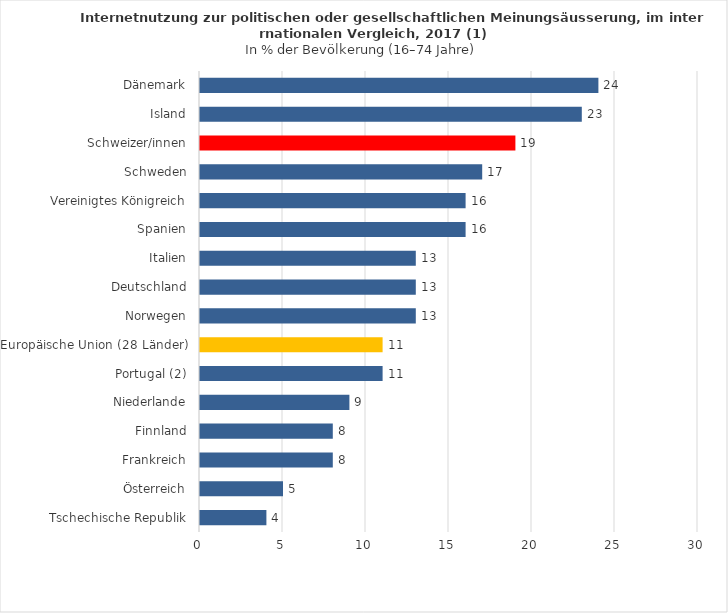
| Category | Series 0 |
|---|---|
| Tschechische Republik | 4 |
| Österreich | 5 |
| Frankreich | 8 |
| Finnland | 8 |
| Niederlande | 9 |
| Portugal (2) | 11 |
| Europäische Union (28 Länder) | 11 |
| Norwegen | 13 |
| Deutschland | 13 |
| Italien | 13 |
| Spanien | 16 |
| Vereinigtes Königreich | 16 |
| Schweden | 17 |
| Schweizer/innen | 19 |
| Island | 23 |
| Dänemark | 24 |